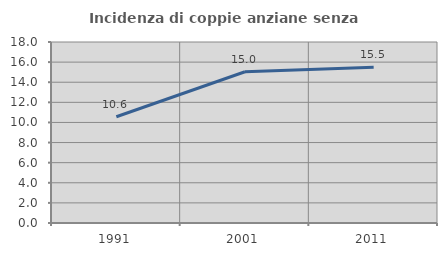
| Category | Incidenza di coppie anziane senza figli  |
|---|---|
| 1991.0 | 10.568 |
| 2001.0 | 15.045 |
| 2011.0 | 15.495 |